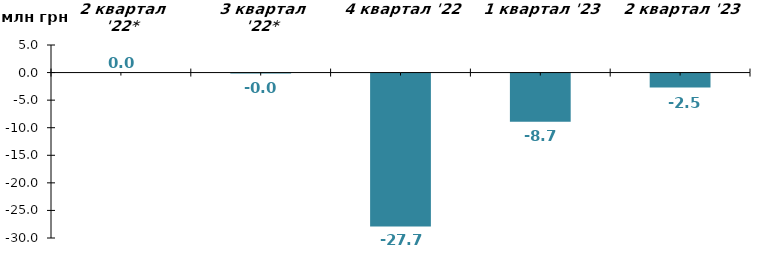
| Category | Чистий притік/відтік за відповідний квартал, млн грн |
|---|---|
| 2 квартал '22* | 0 |
| 3 квартал '22* | -0.002 |
| 4 квартал '22 | -27.72 |
| 1 квартал '23 | -8.74 |
| 2 квартал '23 | -2.517 |